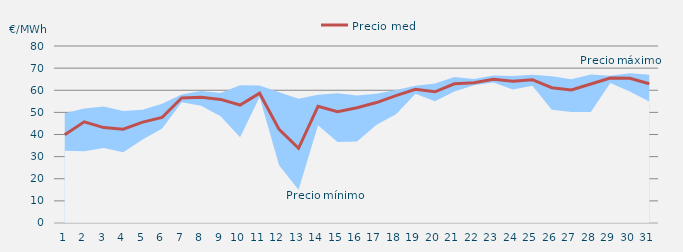
| Category | Precio medio |
|---|---|
| 1.0 | 39.893 |
| 2.0 | 45.755 |
| 3.0 | 43.116 |
| 4.0 | 42.397 |
| 5.0 | 45.577 |
| 6.0 | 47.755 |
| 7.0 | 56.549 |
| 8.0 | 56.814 |
| 9.0 | 55.871 |
| 10.0 | 53.308 |
| 11.0 | 58.669 |
| 12.0 | 42.322 |
| 13.0 | 33.773 |
| 14.0 | 52.722 |
| 15.0 | 50.288 |
| 16.0 | 52.062 |
| 17.0 | 54.43 |
| 18.0 | 57.59 |
| 19.0 | 60.444 |
| 20.0 | 59.294 |
| 21.0 | 62.94 |
| 22.0 | 63.354 |
| 23.0 | 64.984 |
| 24.0 | 64.066 |
| 25.0 | 64.773 |
| 26.0 | 61.127 |
| 27.0 | 60.147 |
| 28.0 | 62.799 |
| 29.0 | 65.495 |
| 30.0 | 65.387 |
| 31.0 | 62.952 |